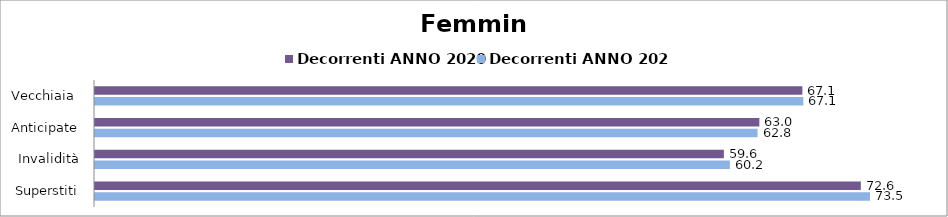
| Category | Decorrenti ANNO 2020 | Decorrenti ANNO 2021 |
|---|---|---|
| Vecchiaia  | 67.05 | 67.14 |
| Anticipate | 62.97 | 62.8 |
| Invalidità | 59.61 | 60.18 |
| Superstiti | 72.59 | 73.46 |